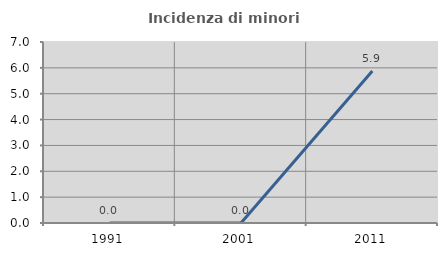
| Category | Incidenza di minori stranieri |
|---|---|
| 1991.0 | 0 |
| 2001.0 | 0 |
| 2011.0 | 5.882 |